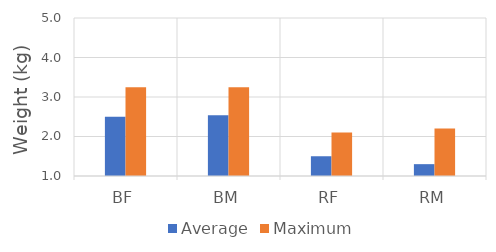
| Category | Average | Maximum |
|---|---|---|
| BF | 2.5 | 3.25 |
| BM | 2.54 | 3.25 |
| RF | 1.5 | 2.1 |
| RM | 1.3 | 2.2 |